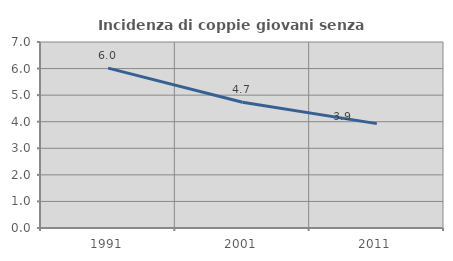
| Category | Incidenza di coppie giovani senza figli |
|---|---|
| 1991.0 | 6.016 |
| 2001.0 | 4.733 |
| 2011.0 | 3.927 |